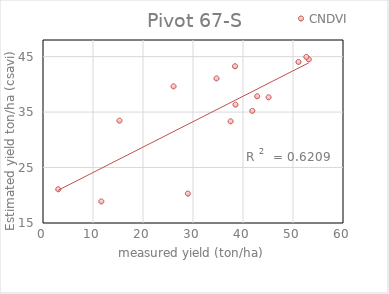
| Category | CNDVI |
|---|---|
| 42.84 | 37.844 |
| 38.400001 | 43.265 |
| 26.11 | 39.635 |
| 11.67 | 18.884 |
| 37.52 | 33.33 |
| 41.86 | 35.22 |
| 3.049999 | 21.081 |
| 15.289999 | 33.455 |
| 38.5 | 36.333 |
| 45.119998 | 37.661 |
| 34.7 | 41.075 |
| 53.159999 | 44.507 |
| 52.669998 | 44.95 |
| 51.09 | 44.036 |
| 28.969999 | 20.298 |